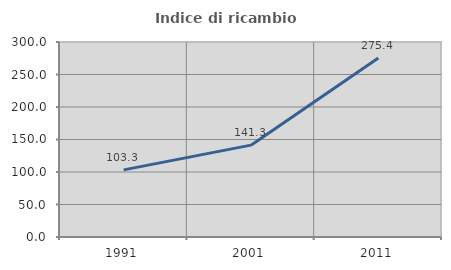
| Category | Indice di ricambio occupazionale  |
|---|---|
| 1991.0 | 103.284 |
| 2001.0 | 141.306 |
| 2011.0 | 275.425 |